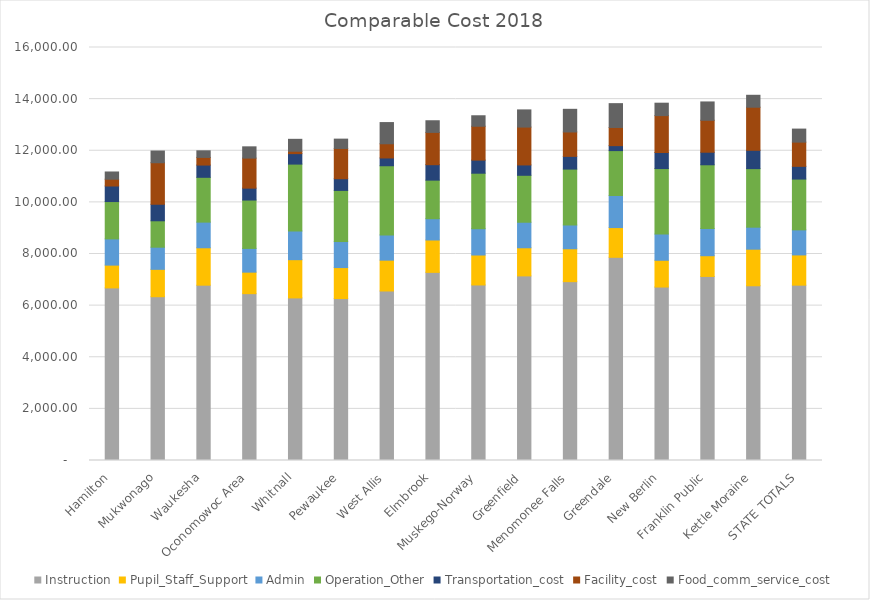
| Category |  Instruction  |  Pupil_Staff_Support  |  Admin  |  Operation_Other  |  Transportation_cost  |  Facility_cost  |  Food_comm_service_cost  |
|---|---|---|---|---|---|---|---|
| Hamilton | 6686.088 | 883.292 | 1016.249 | 1445.99 | 602.658 | 264.126 | 279.162 |
| Mukwonago | 6345.08 | 1060.577 | 857.9 | 1023.138 | 640.582 | 1608.161 | 453.887 |
| Waukesha | 6792.014 | 1449.054 | 993.903 | 1735.88 | 474.436 | 296.409 | 256.086 |
| Oconomowoc Area | 6463.454 | 833.314 | 919.766 | 1873.727 | 461.216 | 1163.768 | 436.614 |
| Whitnall | 6298.597 | 1481.752 | 1111.463 | 2590.851 | 406.027 | 91.244 | 462.818 |
| Pewaukee | 6273.493 | 1200.947 | 1008.554 | 1980.118 | 453.757 | 1171.848 | 361.425 |
| West Allis | 6566.913 | 1195.068 | 976.72 | 2680.436 | 301.8 | 549.349 | 821.411 |
| Elmbrook | 7288.169 | 1254.972 | 824.496 | 1493.752 | 598.336 | 1251.487 | 451.308 |
| Muskego-Norway | 6800.417 | 1160.462 | 1019.234 | 2149.999 | 507.564 | 1311.666 | 406.154 |
| Greenfield | 7151.63 | 1089.55 | 989.179 | 1818.776 | 401.105 | 1467.027 | 665.115 |
| Menomonee Falls | 6928.507 | 1274.576 | 920.868 | 2165.378 | 492.956 | 945.532 | 877.413 |
| Greendale | 7872.054 | 1151.468 | 1242.819 | 1739.159 | 192.871 | 704.281 | 922.299 |
| New Berlin | 6719.948 | 1036.72 | 1014.273 | 2538.527 | 621.95 | 1430.414 | 480.603 |
| Franklin Public | 7130.718 | 802.553 | 1051.033 | 2472.196 | 486.829 | 1237.384 | 710.149 |
| Kettle Moraine | 6769.272 | 1417.155 | 852.442 | 2268.646 | 710.39 | 1668.656 | 462.355 |
| STATE TOTALS | 6793.024 | 1171.334 | 970.499 | 1967.975 | 493.153 | 938.144 | 505.15 |